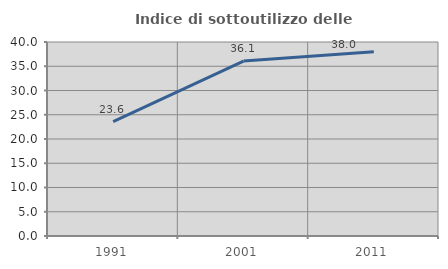
| Category | Indice di sottoutilizzo delle abitazioni  |
|---|---|
| 1991.0 | 23.588 |
| 2001.0 | 36.062 |
| 2011.0 | 37.984 |